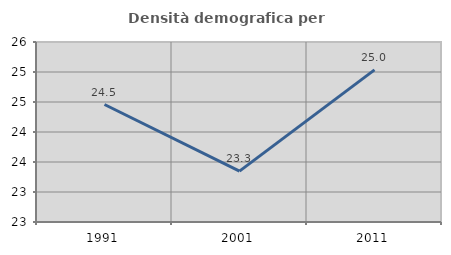
| Category | Densità demografica |
|---|---|
| 1991.0 | 24.458 |
| 2001.0 | 23.348 |
| 2011.0 | 25.036 |